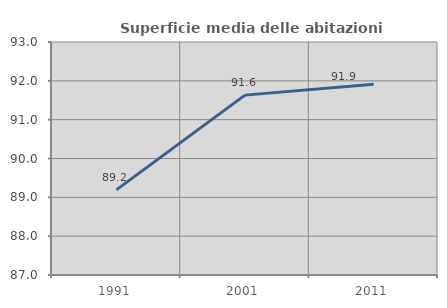
| Category | Superficie media delle abitazioni occupate |
|---|---|
| 1991.0 | 89.193 |
| 2001.0 | 91.632 |
| 2011.0 | 91.911 |